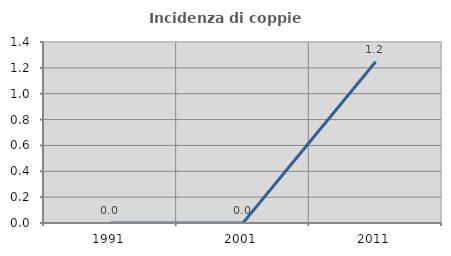
| Category | Incidenza di coppie miste |
|---|---|
| 1991.0 | 0 |
| 2001.0 | 0 |
| 2011.0 | 1.247 |